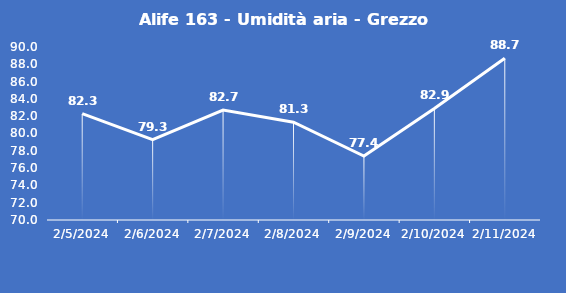
| Category | Alife 163 - Umidità aria - Grezzo (%) |
|---|---|
| 2/5/24 | 82.3 |
| 2/6/24 | 79.3 |
| 2/7/24 | 82.7 |
| 2/8/24 | 81.3 |
| 2/9/24 | 77.4 |
| 2/10/24 | 82.9 |
| 2/11/24 | 88.7 |